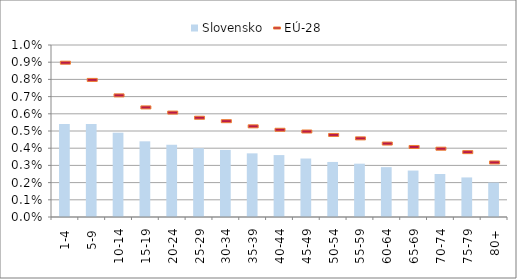
| Category | Slovensko |
|---|---|
|  1-4 | 0.005 |
|  5-9 | 0.005 |
|  10-14 | 0.005 |
|  15-19 | 0.004 |
|  20-24 | 0.004 |
|  25-29 | 0.004 |
|  30-34 | 0.004 |
|  35-39 | 0.004 |
|  40-44 | 0.004 |
|  45-49 | 0.003 |
|  50-54 | 0.003 |
|  55-59 | 0.003 |
|  60-64 | 0.003 |
|  65-69 | 0.003 |
|  70-74 | 0.002 |
|  75-79 | 0.002 |
|  80+ | 0.002 |